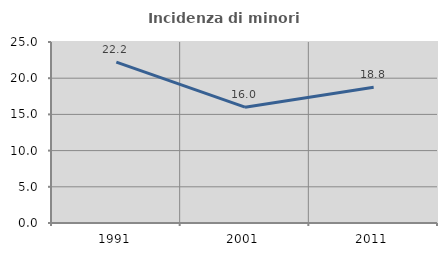
| Category | Incidenza di minori stranieri |
|---|---|
| 1991.0 | 22.222 |
| 2001.0 | 16 |
| 2011.0 | 18.75 |